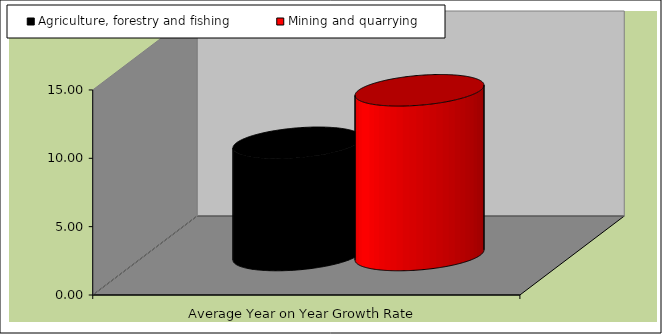
| Category | Agriculture, forestry and fishing | Mining and quarrying |
|---|---|---|
| Average Year on Year Growth Rate | 8.207 | 12.05 |